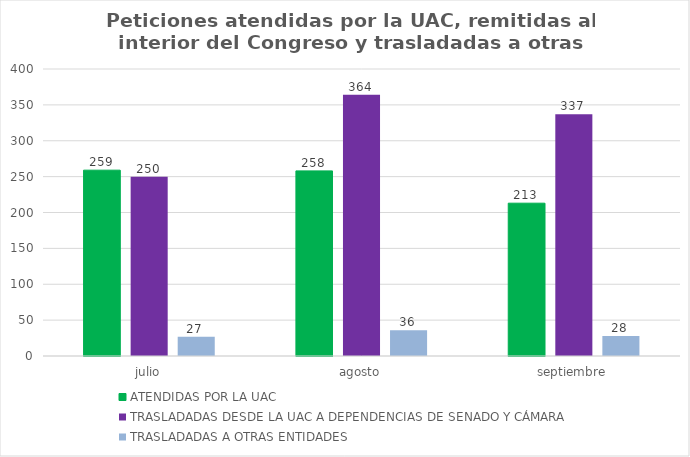
| Category | ATENDIDAS POR LA UAC  | TRASLADADAS DESDE LA UAC A DEPENDENCIAS DE SENADO Y CÁMARA | TRASLADADAS A OTRAS ENTIDADES |
|---|---|---|---|
| julio | 259 | 250 | 27 |
| agosto | 258 | 364 | 36 |
| septiembre | 213 | 337 | 28 |